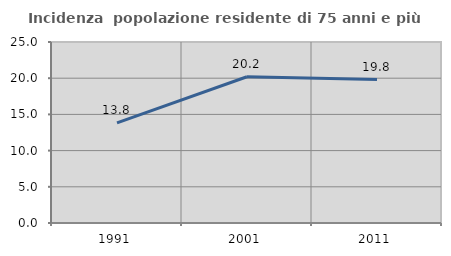
| Category | Incidenza  popolazione residente di 75 anni e più |
|---|---|
| 1991.0 | 13.831 |
| 2001.0 | 20.203 |
| 2011.0 | 19.816 |